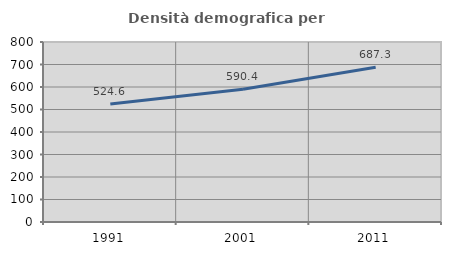
| Category | Densità demografica |
|---|---|
| 1991.0 | 524.632 |
| 2001.0 | 590.437 |
| 2011.0 | 687.336 |